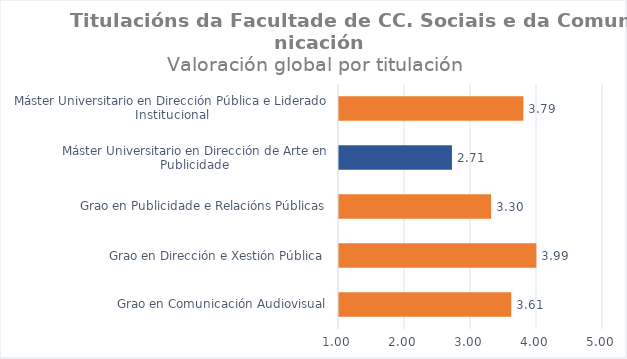
| Category | Series 0 |
|---|---|
| Grao en Comunicación Audiovisual | 3.61 |
| Grao en Dirección e Xestión Pública  | 3.991 |
| Grao en Publicidade e Relacións Públicas | 3.304 |
| Máster Universitario en Dirección de Arte en Publicidade | 2.711 |
| Máster Universitario en Dirección Pública e Liderado Institucional | 3.793 |